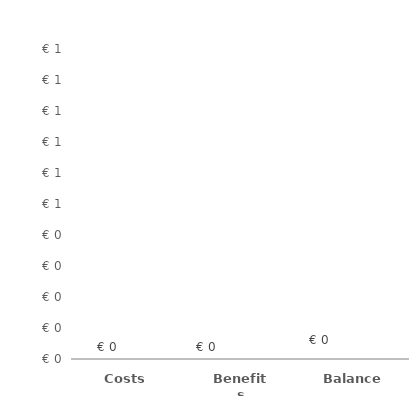
| Category | Series 0 | Series 1 |
|---|---|---|
| Costs | 0 |  |
| Benefits | 0 |  |
| Balance | 0 |  |